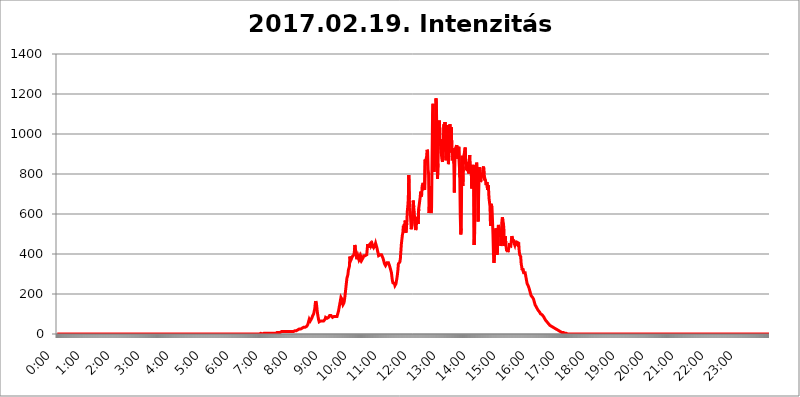
| Category | 2017.02.19. Intenzitás [W/m^2] |
|---|---|
| 0.0 | 0 |
| 0.0006944444444444445 | 0 |
| 0.001388888888888889 | 0 |
| 0.0020833333333333333 | 0 |
| 0.002777777777777778 | 0 |
| 0.003472222222222222 | 0 |
| 0.004166666666666667 | 0 |
| 0.004861111111111111 | 0 |
| 0.005555555555555556 | 0 |
| 0.0062499999999999995 | 0 |
| 0.006944444444444444 | 0 |
| 0.007638888888888889 | 0 |
| 0.008333333333333333 | 0 |
| 0.009027777777777779 | 0 |
| 0.009722222222222222 | 0 |
| 0.010416666666666666 | 0 |
| 0.011111111111111112 | 0 |
| 0.011805555555555555 | 0 |
| 0.012499999999999999 | 0 |
| 0.013194444444444444 | 0 |
| 0.013888888888888888 | 0 |
| 0.014583333333333332 | 0 |
| 0.015277777777777777 | 0 |
| 0.015972222222222224 | 0 |
| 0.016666666666666666 | 0 |
| 0.017361111111111112 | 0 |
| 0.018055555555555557 | 0 |
| 0.01875 | 0 |
| 0.019444444444444445 | 0 |
| 0.02013888888888889 | 0 |
| 0.020833333333333332 | 0 |
| 0.02152777777777778 | 0 |
| 0.022222222222222223 | 0 |
| 0.02291666666666667 | 0 |
| 0.02361111111111111 | 0 |
| 0.024305555555555556 | 0 |
| 0.024999999999999998 | 0 |
| 0.025694444444444447 | 0 |
| 0.02638888888888889 | 0 |
| 0.027083333333333334 | 0 |
| 0.027777777777777776 | 0 |
| 0.02847222222222222 | 0 |
| 0.029166666666666664 | 0 |
| 0.029861111111111113 | 0 |
| 0.030555555555555555 | 0 |
| 0.03125 | 0 |
| 0.03194444444444445 | 0 |
| 0.03263888888888889 | 0 |
| 0.03333333333333333 | 0 |
| 0.034027777777777775 | 0 |
| 0.034722222222222224 | 0 |
| 0.035416666666666666 | 0 |
| 0.036111111111111115 | 0 |
| 0.03680555555555556 | 0 |
| 0.0375 | 0 |
| 0.03819444444444444 | 0 |
| 0.03888888888888889 | 0 |
| 0.03958333333333333 | 0 |
| 0.04027777777777778 | 0 |
| 0.04097222222222222 | 0 |
| 0.041666666666666664 | 0 |
| 0.042361111111111106 | 0 |
| 0.04305555555555556 | 0 |
| 0.043750000000000004 | 0 |
| 0.044444444444444446 | 0 |
| 0.04513888888888889 | 0 |
| 0.04583333333333334 | 0 |
| 0.04652777777777778 | 0 |
| 0.04722222222222222 | 0 |
| 0.04791666666666666 | 0 |
| 0.04861111111111111 | 0 |
| 0.049305555555555554 | 0 |
| 0.049999999999999996 | 0 |
| 0.05069444444444445 | 0 |
| 0.051388888888888894 | 0 |
| 0.052083333333333336 | 0 |
| 0.05277777777777778 | 0 |
| 0.05347222222222222 | 0 |
| 0.05416666666666667 | 0 |
| 0.05486111111111111 | 0 |
| 0.05555555555555555 | 0 |
| 0.05625 | 0 |
| 0.05694444444444444 | 0 |
| 0.057638888888888885 | 0 |
| 0.05833333333333333 | 0 |
| 0.05902777777777778 | 0 |
| 0.059722222222222225 | 0 |
| 0.06041666666666667 | 0 |
| 0.061111111111111116 | 0 |
| 0.06180555555555556 | 0 |
| 0.0625 | 0 |
| 0.06319444444444444 | 0 |
| 0.06388888888888888 | 0 |
| 0.06458333333333334 | 0 |
| 0.06527777777777778 | 0 |
| 0.06597222222222222 | 0 |
| 0.06666666666666667 | 0 |
| 0.06736111111111111 | 0 |
| 0.06805555555555555 | 0 |
| 0.06874999999999999 | 0 |
| 0.06944444444444443 | 0 |
| 0.07013888888888889 | 0 |
| 0.07083333333333333 | 0 |
| 0.07152777777777779 | 0 |
| 0.07222222222222223 | 0 |
| 0.07291666666666667 | 0 |
| 0.07361111111111111 | 0 |
| 0.07430555555555556 | 0 |
| 0.075 | 0 |
| 0.07569444444444444 | 0 |
| 0.0763888888888889 | 0 |
| 0.07708333333333334 | 0 |
| 0.07777777777777778 | 0 |
| 0.07847222222222222 | 0 |
| 0.07916666666666666 | 0 |
| 0.0798611111111111 | 0 |
| 0.08055555555555556 | 0 |
| 0.08125 | 0 |
| 0.08194444444444444 | 0 |
| 0.08263888888888889 | 0 |
| 0.08333333333333333 | 0 |
| 0.08402777777777777 | 0 |
| 0.08472222222222221 | 0 |
| 0.08541666666666665 | 0 |
| 0.08611111111111112 | 0 |
| 0.08680555555555557 | 0 |
| 0.08750000000000001 | 0 |
| 0.08819444444444445 | 0 |
| 0.08888888888888889 | 0 |
| 0.08958333333333333 | 0 |
| 0.09027777777777778 | 0 |
| 0.09097222222222222 | 0 |
| 0.09166666666666667 | 0 |
| 0.09236111111111112 | 0 |
| 0.09305555555555556 | 0 |
| 0.09375 | 0 |
| 0.09444444444444444 | 0 |
| 0.09513888888888888 | 0 |
| 0.09583333333333333 | 0 |
| 0.09652777777777777 | 0 |
| 0.09722222222222222 | 0 |
| 0.09791666666666667 | 0 |
| 0.09861111111111111 | 0 |
| 0.09930555555555555 | 0 |
| 0.09999999999999999 | 0 |
| 0.10069444444444443 | 0 |
| 0.1013888888888889 | 0 |
| 0.10208333333333335 | 0 |
| 0.10277777777777779 | 0 |
| 0.10347222222222223 | 0 |
| 0.10416666666666667 | 0 |
| 0.10486111111111111 | 0 |
| 0.10555555555555556 | 0 |
| 0.10625 | 0 |
| 0.10694444444444444 | 0 |
| 0.1076388888888889 | 0 |
| 0.10833333333333334 | 0 |
| 0.10902777777777778 | 0 |
| 0.10972222222222222 | 0 |
| 0.1111111111111111 | 0 |
| 0.11180555555555556 | 0 |
| 0.11180555555555556 | 0 |
| 0.1125 | 0 |
| 0.11319444444444444 | 0 |
| 0.11388888888888889 | 0 |
| 0.11458333333333333 | 0 |
| 0.11527777777777777 | 0 |
| 0.11597222222222221 | 0 |
| 0.11666666666666665 | 0 |
| 0.1173611111111111 | 0 |
| 0.11805555555555557 | 0 |
| 0.11944444444444445 | 0 |
| 0.12013888888888889 | 0 |
| 0.12083333333333333 | 0 |
| 0.12152777777777778 | 0 |
| 0.12222222222222223 | 0 |
| 0.12291666666666667 | 0 |
| 0.12291666666666667 | 0 |
| 0.12361111111111112 | 0 |
| 0.12430555555555556 | 0 |
| 0.125 | 0 |
| 0.12569444444444444 | 0 |
| 0.12638888888888888 | 0 |
| 0.12708333333333333 | 0 |
| 0.16875 | 0 |
| 0.12847222222222224 | 0 |
| 0.12916666666666668 | 0 |
| 0.12986111111111112 | 0 |
| 0.13055555555555556 | 0 |
| 0.13125 | 0 |
| 0.13194444444444445 | 0 |
| 0.1326388888888889 | 0 |
| 0.13333333333333333 | 0 |
| 0.13402777777777777 | 0 |
| 0.13402777777777777 | 0 |
| 0.13472222222222222 | 0 |
| 0.13541666666666666 | 0 |
| 0.1361111111111111 | 0 |
| 0.13749999999999998 | 0 |
| 0.13819444444444443 | 0 |
| 0.1388888888888889 | 0 |
| 0.13958333333333334 | 0 |
| 0.14027777777777778 | 0 |
| 0.14097222222222222 | 0 |
| 0.14166666666666666 | 0 |
| 0.1423611111111111 | 0 |
| 0.14305555555555557 | 0 |
| 0.14375000000000002 | 0 |
| 0.14444444444444446 | 0 |
| 0.1451388888888889 | 0 |
| 0.1451388888888889 | 0 |
| 0.14652777777777778 | 0 |
| 0.14722222222222223 | 0 |
| 0.14791666666666667 | 0 |
| 0.1486111111111111 | 0 |
| 0.14930555555555555 | 0 |
| 0.15 | 0 |
| 0.15069444444444444 | 0 |
| 0.15138888888888888 | 0 |
| 0.15208333333333332 | 0 |
| 0.15277777777777776 | 0 |
| 0.15347222222222223 | 0 |
| 0.15416666666666667 | 0 |
| 0.15486111111111112 | 0 |
| 0.15555555555555556 | 0 |
| 0.15625 | 0 |
| 0.15694444444444444 | 0 |
| 0.15763888888888888 | 0 |
| 0.15833333333333333 | 0 |
| 0.15902777777777777 | 0 |
| 0.15972222222222224 | 0 |
| 0.16041666666666668 | 0 |
| 0.16111111111111112 | 0 |
| 0.16180555555555556 | 0 |
| 0.1625 | 0 |
| 0.16319444444444445 | 0 |
| 0.1638888888888889 | 0 |
| 0.16458333333333333 | 0 |
| 0.16527777777777777 | 0 |
| 0.16597222222222222 | 0 |
| 0.16666666666666666 | 0 |
| 0.1673611111111111 | 0 |
| 0.16805555555555554 | 0 |
| 0.16874999999999998 | 0 |
| 0.16944444444444443 | 0 |
| 0.17013888888888887 | 0 |
| 0.1708333333333333 | 0 |
| 0.17152777777777775 | 0 |
| 0.17222222222222225 | 0 |
| 0.1729166666666667 | 0 |
| 0.17361111111111113 | 0 |
| 0.17430555555555557 | 0 |
| 0.17500000000000002 | 0 |
| 0.17569444444444446 | 0 |
| 0.1763888888888889 | 0 |
| 0.17708333333333334 | 0 |
| 0.17777777777777778 | 0 |
| 0.17847222222222223 | 0 |
| 0.17916666666666667 | 0 |
| 0.1798611111111111 | 0 |
| 0.18055555555555555 | 0 |
| 0.18125 | 0 |
| 0.18194444444444444 | 0 |
| 0.1826388888888889 | 0 |
| 0.18333333333333335 | 0 |
| 0.1840277777777778 | 0 |
| 0.18472222222222223 | 0 |
| 0.18541666666666667 | 0 |
| 0.18611111111111112 | 0 |
| 0.18680555555555556 | 0 |
| 0.1875 | 0 |
| 0.18819444444444444 | 0 |
| 0.18888888888888888 | 0 |
| 0.18958333333333333 | 0 |
| 0.19027777777777777 | 0 |
| 0.1909722222222222 | 0 |
| 0.19166666666666665 | 0 |
| 0.19236111111111112 | 0 |
| 0.19305555555555554 | 0 |
| 0.19375 | 0 |
| 0.19444444444444445 | 0 |
| 0.1951388888888889 | 0 |
| 0.19583333333333333 | 0 |
| 0.19652777777777777 | 0 |
| 0.19722222222222222 | 0 |
| 0.19791666666666666 | 0 |
| 0.1986111111111111 | 0 |
| 0.19930555555555554 | 0 |
| 0.19999999999999998 | 0 |
| 0.20069444444444443 | 0 |
| 0.20138888888888887 | 0 |
| 0.2020833333333333 | 0 |
| 0.2027777777777778 | 0 |
| 0.2034722222222222 | 0 |
| 0.2041666666666667 | 0 |
| 0.20486111111111113 | 0 |
| 0.20555555555555557 | 0 |
| 0.20625000000000002 | 0 |
| 0.20694444444444446 | 0 |
| 0.2076388888888889 | 0 |
| 0.20833333333333334 | 0 |
| 0.20902777777777778 | 0 |
| 0.20972222222222223 | 0 |
| 0.21041666666666667 | 0 |
| 0.2111111111111111 | 0 |
| 0.21180555555555555 | 0 |
| 0.2125 | 0 |
| 0.21319444444444444 | 0 |
| 0.2138888888888889 | 0 |
| 0.21458333333333335 | 0 |
| 0.2152777777777778 | 0 |
| 0.21597222222222223 | 0 |
| 0.21666666666666667 | 0 |
| 0.21736111111111112 | 0 |
| 0.21805555555555556 | 0 |
| 0.21875 | 0 |
| 0.21944444444444444 | 0 |
| 0.22013888888888888 | 0 |
| 0.22083333333333333 | 0 |
| 0.22152777777777777 | 0 |
| 0.2222222222222222 | 0 |
| 0.22291666666666665 | 0 |
| 0.2236111111111111 | 0 |
| 0.22430555555555556 | 0 |
| 0.225 | 0 |
| 0.22569444444444445 | 0 |
| 0.2263888888888889 | 0 |
| 0.22708333333333333 | 0 |
| 0.22777777777777777 | 0 |
| 0.22847222222222222 | 0 |
| 0.22916666666666666 | 0 |
| 0.2298611111111111 | 0 |
| 0.23055555555555554 | 0 |
| 0.23124999999999998 | 0 |
| 0.23194444444444443 | 0 |
| 0.23263888888888887 | 0 |
| 0.2333333333333333 | 0 |
| 0.2340277777777778 | 0 |
| 0.2347222222222222 | 0 |
| 0.2354166666666667 | 0 |
| 0.23611111111111113 | 0 |
| 0.23680555555555557 | 0 |
| 0.23750000000000002 | 0 |
| 0.23819444444444446 | 0 |
| 0.2388888888888889 | 0 |
| 0.23958333333333334 | 0 |
| 0.24027777777777778 | 0 |
| 0.24097222222222223 | 0 |
| 0.24166666666666667 | 0 |
| 0.2423611111111111 | 0 |
| 0.24305555555555555 | 0 |
| 0.24375 | 0 |
| 0.24444444444444446 | 0 |
| 0.24513888888888888 | 0 |
| 0.24583333333333335 | 0 |
| 0.2465277777777778 | 0 |
| 0.24722222222222223 | 0 |
| 0.24791666666666667 | 0 |
| 0.24861111111111112 | 0 |
| 0.24930555555555556 | 0 |
| 0.25 | 0 |
| 0.25069444444444444 | 0 |
| 0.2513888888888889 | 0 |
| 0.2520833333333333 | 0 |
| 0.25277777777777777 | 0 |
| 0.2534722222222222 | 0 |
| 0.25416666666666665 | 0 |
| 0.2548611111111111 | 0 |
| 0.2555555555555556 | 0 |
| 0.25625000000000003 | 0 |
| 0.2569444444444445 | 0 |
| 0.2576388888888889 | 0 |
| 0.25833333333333336 | 0 |
| 0.2590277777777778 | 0 |
| 0.25972222222222224 | 0 |
| 0.2604166666666667 | 0 |
| 0.2611111111111111 | 0 |
| 0.26180555555555557 | 0 |
| 0.2625 | 0 |
| 0.26319444444444445 | 0 |
| 0.2638888888888889 | 0 |
| 0.26458333333333334 | 0 |
| 0.2652777777777778 | 0 |
| 0.2659722222222222 | 0 |
| 0.26666666666666666 | 0 |
| 0.2673611111111111 | 0 |
| 0.26805555555555555 | 0 |
| 0.26875 | 0 |
| 0.26944444444444443 | 0 |
| 0.2701388888888889 | 0 |
| 0.2708333333333333 | 0 |
| 0.27152777777777776 | 0 |
| 0.2722222222222222 | 0 |
| 0.27291666666666664 | 0 |
| 0.2736111111111111 | 0 |
| 0.2743055555555555 | 0 |
| 0.27499999999999997 | 0 |
| 0.27569444444444446 | 0 |
| 0.27638888888888885 | 0 |
| 0.27708333333333335 | 0 |
| 0.2777777777777778 | 0 |
| 0.27847222222222223 | 0 |
| 0.2791666666666667 | 0 |
| 0.2798611111111111 | 0 |
| 0.28055555555555556 | 0 |
| 0.28125 | 0 |
| 0.28194444444444444 | 0 |
| 0.2826388888888889 | 0 |
| 0.2833333333333333 | 0 |
| 0.28402777777777777 | 0 |
| 0.2847222222222222 | 0 |
| 0.28541666666666665 | 3.525 |
| 0.28611111111111115 | 0 |
| 0.28680555555555554 | 0 |
| 0.28750000000000003 | 0 |
| 0.2881944444444445 | 0 |
| 0.2888888888888889 | 0 |
| 0.28958333333333336 | 3.525 |
| 0.2902777777777778 | 0 |
| 0.29097222222222224 | 3.525 |
| 0.2916666666666667 | 3.525 |
| 0.2923611111111111 | 3.525 |
| 0.29305555555555557 | 3.525 |
| 0.29375 | 3.525 |
| 0.29444444444444445 | 3.525 |
| 0.2951388888888889 | 3.525 |
| 0.29583333333333334 | 3.525 |
| 0.2965277777777778 | 3.525 |
| 0.2972222222222222 | 3.525 |
| 0.29791666666666666 | 3.525 |
| 0.2986111111111111 | 3.525 |
| 0.29930555555555555 | 3.525 |
| 0.3 | 3.525 |
| 0.30069444444444443 | 3.525 |
| 0.3013888888888889 | 3.525 |
| 0.3020833333333333 | 3.525 |
| 0.30277777777777776 | 3.525 |
| 0.3034722222222222 | 3.525 |
| 0.30416666666666664 | 3.525 |
| 0.3048611111111111 | 3.525 |
| 0.3055555555555555 | 3.525 |
| 0.30624999999999997 | 3.525 |
| 0.3069444444444444 | 7.887 |
| 0.3076388888888889 | 7.887 |
| 0.30833333333333335 | 7.887 |
| 0.3090277777777778 | 7.887 |
| 0.30972222222222223 | 7.887 |
| 0.3104166666666667 | 7.887 |
| 0.3111111111111111 | 7.887 |
| 0.31180555555555556 | 7.887 |
| 0.3125 | 7.887 |
| 0.31319444444444444 | 12.257 |
| 0.3138888888888889 | 12.257 |
| 0.3145833333333333 | 12.257 |
| 0.31527777777777777 | 12.257 |
| 0.3159722222222222 | 12.257 |
| 0.31666666666666665 | 12.257 |
| 0.31736111111111115 | 12.257 |
| 0.31805555555555554 | 12.257 |
| 0.31875000000000003 | 12.257 |
| 0.3194444444444445 | 12.257 |
| 0.3201388888888889 | 12.257 |
| 0.32083333333333336 | 12.257 |
| 0.3215277777777778 | 16.636 |
| 0.32222222222222224 | 16.636 |
| 0.3229166666666667 | 12.257 |
| 0.3236111111111111 | 16.636 |
| 0.32430555555555557 | 16.636 |
| 0.325 | 12.257 |
| 0.32569444444444445 | 12.257 |
| 0.3263888888888889 | 12.257 |
| 0.32708333333333334 | 12.257 |
| 0.3277777777777778 | 12.257 |
| 0.3284722222222222 | 12.257 |
| 0.32916666666666666 | 12.257 |
| 0.3298611111111111 | 12.257 |
| 0.33055555555555555 | 12.257 |
| 0.33125 | 12.257 |
| 0.33194444444444443 | 12.257 |
| 0.3326388888888889 | 16.636 |
| 0.3333333333333333 | 16.636 |
| 0.3340277777777778 | 21.024 |
| 0.3347222222222222 | 16.636 |
| 0.3354166666666667 | 16.636 |
| 0.3361111111111111 | 21.024 |
| 0.3368055555555556 | 21.024 |
| 0.33749999999999997 | 21.024 |
| 0.33819444444444446 | 25.419 |
| 0.33888888888888885 | 25.419 |
| 0.33958333333333335 | 25.419 |
| 0.34027777777777773 | 25.419 |
| 0.34097222222222223 | 25.419 |
| 0.3416666666666666 | 25.419 |
| 0.3423611111111111 | 29.823 |
| 0.3430555555555555 | 29.823 |
| 0.34375 | 29.823 |
| 0.3444444444444445 | 29.823 |
| 0.3451388888888889 | 29.823 |
| 0.3458333333333334 | 34.234 |
| 0.34652777777777777 | 34.234 |
| 0.34722222222222227 | 34.234 |
| 0.34791666666666665 | 34.234 |
| 0.34861111111111115 | 34.234 |
| 0.34930555555555554 | 34.234 |
| 0.35000000000000003 | 38.653 |
| 0.3506944444444444 | 38.653 |
| 0.3513888888888889 | 47.511 |
| 0.3520833333333333 | 56.398 |
| 0.3527777777777778 | 65.31 |
| 0.3534722222222222 | 74.246 |
| 0.3541666666666667 | 69.775 |
| 0.3548611111111111 | 65.31 |
| 0.35555555555555557 | 65.31 |
| 0.35625 | 65.31 |
| 0.35694444444444445 | 78.722 |
| 0.3576388888888889 | 83.205 |
| 0.35833333333333334 | 92.184 |
| 0.3590277777777778 | 92.184 |
| 0.3597222222222222 | 101.184 |
| 0.36041666666666666 | 114.716 |
| 0.3611111111111111 | 123.758 |
| 0.36180555555555555 | 150.964 |
| 0.3625 | 164.605 |
| 0.36319444444444443 | 169.156 |
| 0.3638888888888889 | 141.884 |
| 0.3645833333333333 | 114.716 |
| 0.3652777777777778 | 96.682 |
| 0.3659722222222222 | 83.205 |
| 0.3666666666666667 | 69.775 |
| 0.3673611111111111 | 60.85 |
| 0.3680555555555556 | 56.398 |
| 0.36874999999999997 | 60.85 |
| 0.36944444444444446 | 65.31 |
| 0.37013888888888885 | 60.85 |
| 0.37083333333333335 | 60.85 |
| 0.37152777777777773 | 65.31 |
| 0.37222222222222223 | 65.31 |
| 0.3729166666666666 | 65.31 |
| 0.3736111111111111 | 65.31 |
| 0.3743055555555555 | 60.85 |
| 0.375 | 65.31 |
| 0.3756944444444445 | 74.246 |
| 0.3763888888888889 | 83.205 |
| 0.3770833333333334 | 87.692 |
| 0.37777777777777777 | 83.205 |
| 0.37847222222222227 | 78.722 |
| 0.37916666666666665 | 78.722 |
| 0.37986111111111115 | 78.722 |
| 0.38055555555555554 | 83.205 |
| 0.38125000000000003 | 83.205 |
| 0.3819444444444444 | 92.184 |
| 0.3826388888888889 | 92.184 |
| 0.3833333333333333 | 92.184 |
| 0.3840277777777778 | 92.184 |
| 0.3847222222222222 | 96.682 |
| 0.3854166666666667 | 92.184 |
| 0.3861111111111111 | 83.205 |
| 0.38680555555555557 | 83.205 |
| 0.3875 | 83.205 |
| 0.38819444444444445 | 87.692 |
| 0.3888888888888889 | 92.184 |
| 0.38958333333333334 | 92.184 |
| 0.3902777777777778 | 87.692 |
| 0.3909722222222222 | 83.205 |
| 0.39166666666666666 | 83.205 |
| 0.3923611111111111 | 87.692 |
| 0.39305555555555555 | 92.184 |
| 0.39375 | 105.69 |
| 0.39444444444444443 | 114.716 |
| 0.3951388888888889 | 128.284 |
| 0.3958333333333333 | 141.884 |
| 0.3965277777777778 | 155.509 |
| 0.3972222222222222 | 169.156 |
| 0.3979166666666667 | 182.82 |
| 0.3986111111111111 | 182.82 |
| 0.3993055555555556 | 173.709 |
| 0.39999999999999997 | 155.509 |
| 0.40069444444444446 | 146.423 |
| 0.40138888888888885 | 146.423 |
| 0.40208333333333335 | 155.509 |
| 0.40277777777777773 | 169.156 |
| 0.40347222222222223 | 187.378 |
| 0.4041666666666666 | 210.182 |
| 0.4048611111111111 | 233 |
| 0.4055555555555555 | 255.813 |
| 0.40625 | 278.603 |
| 0.4069444444444445 | 287.709 |
| 0.4076388888888889 | 296.808 |
| 0.4083333333333334 | 319.517 |
| 0.40902777777777777 | 328.584 |
| 0.40972222222222227 | 337.639 |
| 0.41041666666666665 | 387.202 |
| 0.41111111111111115 | 391.685 |
| 0.41180555555555554 | 369.23 |
| 0.41250000000000003 | 373.729 |
| 0.4131944444444444 | 373.729 |
| 0.4138888888888889 | 387.202 |
| 0.4145833333333333 | 387.202 |
| 0.4152777777777778 | 391.685 |
| 0.4159722222222222 | 396.164 |
| 0.4166666666666667 | 409.574 |
| 0.4173611111111111 | 445.129 |
| 0.41805555555555557 | 431.833 |
| 0.41875 | 400.638 |
| 0.41944444444444445 | 391.685 |
| 0.4201388888888889 | 373.729 |
| 0.42083333333333334 | 373.729 |
| 0.4215277777777778 | 391.685 |
| 0.4222222222222222 | 396.164 |
| 0.42291666666666666 | 373.729 |
| 0.4236111111111111 | 369.23 |
| 0.42430555555555555 | 387.202 |
| 0.425 | 378.224 |
| 0.42569444444444443 | 387.202 |
| 0.4263888888888889 | 387.202 |
| 0.4270833333333333 | 369.23 |
| 0.4277777777777778 | 364.728 |
| 0.4284722222222222 | 373.729 |
| 0.4291666666666667 | 382.715 |
| 0.4298611111111111 | 391.685 |
| 0.4305555555555556 | 391.685 |
| 0.43124999999999997 | 391.685 |
| 0.43194444444444446 | 391.685 |
| 0.43263888888888885 | 391.685 |
| 0.43333333333333335 | 391.685 |
| 0.43402777777777773 | 396.164 |
| 0.43472222222222223 | 422.943 |
| 0.4354166666666666 | 449.551 |
| 0.4361111111111111 | 431.833 |
| 0.4368055555555555 | 431.833 |
| 0.4375 | 445.129 |
| 0.4381944444444445 | 440.702 |
| 0.4388888888888889 | 449.551 |
| 0.4395833333333334 | 453.968 |
| 0.44027777777777777 | 440.702 |
| 0.44097222222222227 | 445.129 |
| 0.44166666666666665 | 449.551 |
| 0.44236111111111115 | 440.702 |
| 0.44305555555555554 | 440.702 |
| 0.44375000000000003 | 431.833 |
| 0.4444444444444444 | 427.39 |
| 0.4451388888888889 | 431.833 |
| 0.4458333333333333 | 445.129 |
| 0.4465277777777778 | 453.968 |
| 0.4472222222222222 | 458.38 |
| 0.4479166666666667 | 449.551 |
| 0.4486111111111111 | 427.39 |
| 0.44930555555555557 | 414.035 |
| 0.45 | 405.108 |
| 0.45069444444444445 | 391.685 |
| 0.4513888888888889 | 387.202 |
| 0.45208333333333334 | 396.164 |
| 0.4527777777777778 | 396.164 |
| 0.4534722222222222 | 391.685 |
| 0.45416666666666666 | 391.685 |
| 0.4548611111111111 | 396.164 |
| 0.45555555555555555 | 396.164 |
| 0.45625 | 391.685 |
| 0.45694444444444443 | 378.224 |
| 0.4576388888888889 | 369.23 |
| 0.4583333333333333 | 360.221 |
| 0.4590277777777778 | 351.198 |
| 0.4597222222222222 | 346.682 |
| 0.4604166666666667 | 342.162 |
| 0.4611111111111111 | 346.682 |
| 0.4618055555555556 | 346.682 |
| 0.46249999999999997 | 355.712 |
| 0.46319444444444446 | 355.712 |
| 0.46388888888888885 | 355.712 |
| 0.46458333333333335 | 355.712 |
| 0.46527777777777773 | 351.198 |
| 0.46597222222222223 | 342.162 |
| 0.4666666666666666 | 337.639 |
| 0.4673611111111111 | 324.052 |
| 0.4680555555555555 | 314.98 |
| 0.46875 | 305.898 |
| 0.4694444444444445 | 283.156 |
| 0.4701388888888889 | 264.932 |
| 0.4708333333333334 | 255.813 |
| 0.47152777777777777 | 255.813 |
| 0.47222222222222227 | 255.813 |
| 0.47291666666666665 | 251.251 |
| 0.47361111111111115 | 242.127 |
| 0.47430555555555554 | 246.689 |
| 0.47500000000000003 | 251.251 |
| 0.4756944444444444 | 264.932 |
| 0.4763888888888889 | 278.603 |
| 0.4770833333333333 | 296.808 |
| 0.4777777777777778 | 319.517 |
| 0.4784722222222222 | 351.198 |
| 0.4791666666666667 | 346.682 |
| 0.4798611111111111 | 351.198 |
| 0.48055555555555557 | 360.221 |
| 0.48125 | 378.224 |
| 0.48194444444444445 | 414.035 |
| 0.4826388888888889 | 449.551 |
| 0.48333333333333334 | 471.582 |
| 0.4840277777777778 | 493.475 |
| 0.4847222222222222 | 506.542 |
| 0.48541666666666666 | 541.121 |
| 0.4861111111111111 | 515.223 |
| 0.48680555555555555 | 549.704 |
| 0.4875 | 541.121 |
| 0.48819444444444443 | 566.793 |
| 0.4888888888888889 | 506.542 |
| 0.4895833333333333 | 510.885 |
| 0.4902777777777778 | 553.986 |
| 0.4909722222222222 | 613.252 |
| 0.4916666666666667 | 638.256 |
| 0.4923611111111111 | 675.311 |
| 0.4930555555555556 | 795.074 |
| 0.49374999999999997 | 675.311 |
| 0.49444444444444446 | 634.105 |
| 0.49513888888888885 | 604.864 |
| 0.49583333333333335 | 566.793 |
| 0.49652777777777773 | 523.88 |
| 0.49722222222222223 | 523.88 |
| 0.4979166666666666 | 523.88 |
| 0.4986111111111111 | 596.45 |
| 0.4993055555555555 | 667.123 |
| 0.5 | 634.105 |
| 0.5006944444444444 | 609.062 |
| 0.5013888888888889 | 553.986 |
| 0.5020833333333333 | 532.513 |
| 0.5027777777777778 | 519.555 |
| 0.5034722222222222 | 532.513 |
| 0.5041666666666667 | 571.049 |
| 0.5048611111111111 | 571.049 |
| 0.5055555555555555 | 562.53 |
| 0.50625 | 549.704 |
| 0.5069444444444444 | 625.784 |
| 0.5076388888888889 | 625.784 |
| 0.5083333333333333 | 621.613 |
| 0.5090277777777777 | 683.473 |
| 0.5097222222222222 | 711.832 |
| 0.5104166666666666 | 687.544 |
| 0.5111111111111112 | 695.666 |
| 0.5118055555555555 | 739.877 |
| 0.5125000000000001 | 743.859 |
| 0.5131944444444444 | 755.766 |
| 0.513888888888889 | 759.723 |
| 0.5145833333333333 | 751.803 |
| 0.5152777777777778 | 719.877 |
| 0.5159722222222222 | 872.114 |
| 0.5166666666666667 | 864.493 |
| 0.517361111111111 | 864.493 |
| 0.5180555555555556 | 887.309 |
| 0.5187499999999999 | 921.298 |
| 0.5194444444444445 | 913.766 |
| 0.5201388888888888 | 822.26 |
| 0.5208333333333334 | 798.974 |
| 0.5215277777777778 | 604.864 |
| 0.5222222222222223 | 658.909 |
| 0.5229166666666667 | 739.877 |
| 0.5236111111111111 | 617.436 |
| 0.5243055555555556 | 604.864 |
| 0.525 | 629.948 |
| 0.5256944444444445 | 872.114 |
| 0.5263888888888889 | 1097.437 |
| 0.5270833333333333 | 1150.946 |
| 0.5277777777777778 | 894.885 |
| 0.5284722222222222 | 810.641 |
| 0.5291666666666667 | 849.199 |
| 0.5298611111111111 | 894.885 |
| 0.5305555555555556 | 1037.277 |
| 0.53125 | 1178.177 |
| 0.5319444444444444 | 1101.226 |
| 0.5326388888888889 | 947.58 |
| 0.5333333333333333 | 775.492 |
| 0.5340277777777778 | 853.029 |
| 0.5347222222222222 | 981.244 |
| 0.5354166666666667 | 977.508 |
| 0.5361111111111111 | 1067.267 |
| 0.5368055555555555 | 940.082 |
| 0.5375 | 973.772 |
| 0.5381944444444444 | 973.772 |
| 0.5388888888888889 | 894.885 |
| 0.5395833333333333 | 872.114 |
| 0.5402777777777777 | 860.676 |
| 0.5409722222222222 | 921.298 |
| 0.5416666666666666 | 977.508 |
| 0.5423611111111112 | 1048.508 |
| 0.5430555555555555 | 913.766 |
| 0.5437500000000001 | 1059.756 |
| 0.5444444444444444 | 966.295 |
| 0.545138888888889 | 868.305 |
| 0.5458333333333333 | 921.298 |
| 0.5465277777777778 | 872.114 |
| 0.5472222222222222 | 1044.762 |
| 0.5479166666666667 | 943.832 |
| 0.548611111111111 | 849.199 |
| 0.5493055555555556 | 887.309 |
| 0.5499999999999999 | 984.98 |
| 0.5506944444444445 | 1048.508 |
| 0.5513888888888888 | 951.327 |
| 0.5520833333333334 | 1011.118 |
| 0.5527777777777778 | 1033.537 |
| 0.5534722222222223 | 906.223 |
| 0.5541666666666667 | 928.819 |
| 0.5548611111111111 | 868.305 |
| 0.5555555555555556 | 909.996 |
| 0.55625 | 853.029 |
| 0.5569444444444445 | 707.8 |
| 0.5576388888888889 | 917.534 |
| 0.5583333333333333 | 925.06 |
| 0.5590277777777778 | 917.534 |
| 0.5597222222222222 | 913.766 |
| 0.5604166666666667 | 943.832 |
| 0.5611111111111111 | 894.885 |
| 0.5618055555555556 | 875.918 |
| 0.5625 | 898.668 |
| 0.5631944444444444 | 936.33 |
| 0.5638888888888889 | 932.576 |
| 0.5645833333333333 | 783.342 |
| 0.5652777777777778 | 588.009 |
| 0.5659722222222222 | 497.836 |
| 0.5666666666666667 | 528.2 |
| 0.5673611111111111 | 853.029 |
| 0.5680555555555555 | 891.099 |
| 0.56875 | 739.877 |
| 0.5694444444444444 | 837.682 |
| 0.5701388888888889 | 887.309 |
| 0.5708333333333333 | 891.099 |
| 0.5715277777777777 | 883.516 |
| 0.5722222222222222 | 932.576 |
| 0.5729166666666666 | 860.676 |
| 0.5736111111111112 | 818.392 |
| 0.5743055555555555 | 826.123 |
| 0.5750000000000001 | 853.029 |
| 0.5756944444444444 | 814.519 |
| 0.576388888888889 | 860.676 |
| 0.5770833333333333 | 802.868 |
| 0.5777777777777778 | 853.029 |
| 0.5784722222222222 | 894.885 |
| 0.5791666666666667 | 806.757 |
| 0.579861111111111 | 845.365 |
| 0.5805555555555556 | 829.981 |
| 0.5812499999999999 | 727.896 |
| 0.5819444444444445 | 822.26 |
| 0.5826388888888888 | 845.365 |
| 0.5833333333333334 | 829.981 |
| 0.5840277777777778 | 845.365 |
| 0.5847222222222223 | 445.129 |
| 0.5854166666666667 | 506.542 |
| 0.5861111111111111 | 654.791 |
| 0.5868055555555556 | 767.62 |
| 0.5875 | 841.526 |
| 0.5881944444444445 | 856.855 |
| 0.5888888888888889 | 810.641 |
| 0.5895833333333333 | 735.89 |
| 0.5902777777777778 | 562.53 |
| 0.5909722222222222 | 687.544 |
| 0.5916666666666667 | 795.074 |
| 0.5923611111111111 | 833.834 |
| 0.5930555555555556 | 787.258 |
| 0.59375 | 759.723 |
| 0.5944444444444444 | 771.559 |
| 0.5951388888888889 | 795.074 |
| 0.5958333333333333 | 783.342 |
| 0.5965277777777778 | 802.868 |
| 0.5972222222222222 | 829.981 |
| 0.5979166666666667 | 837.682 |
| 0.5986111111111111 | 798.974 |
| 0.5993055555555555 | 767.62 |
| 0.6 | 775.492 |
| 0.6006944444444444 | 767.62 |
| 0.6013888888888889 | 743.859 |
| 0.6020833333333333 | 743.859 |
| 0.6027777777777777 | 759.723 |
| 0.6034722222222222 | 719.877 |
| 0.6041666666666666 | 743.859 |
| 0.6048611111111112 | 727.896 |
| 0.6055555555555555 | 679.395 |
| 0.6062500000000001 | 675.311 |
| 0.6069444444444444 | 638.256 |
| 0.607638888888889 | 541.121 |
| 0.6083333333333333 | 650.667 |
| 0.6090277777777778 | 646.537 |
| 0.6097222222222222 | 634.105 |
| 0.6104166666666667 | 571.049 |
| 0.611111111111111 | 497.836 |
| 0.6118055555555556 | 400.638 |
| 0.6124999999999999 | 355.712 |
| 0.6131944444444445 | 391.685 |
| 0.6138888888888888 | 462.786 |
| 0.6145833333333334 | 515.223 |
| 0.6152777777777778 | 528.2 |
| 0.6159722222222223 | 502.192 |
| 0.6166666666666667 | 396.164 |
| 0.6173611111111111 | 409.574 |
| 0.6180555555555556 | 519.555 |
| 0.61875 | 545.416 |
| 0.6194444444444445 | 549.704 |
| 0.6201388888888889 | 519.555 |
| 0.6208333333333333 | 510.885 |
| 0.6215277777777778 | 523.88 |
| 0.6222222222222222 | 440.702 |
| 0.6229166666666667 | 449.551 |
| 0.6236111111111111 | 562.53 |
| 0.6243055555555556 | 583.779 |
| 0.625 | 566.793 |
| 0.6256944444444444 | 553.986 |
| 0.6263888888888889 | 528.2 |
| 0.6270833333333333 | 440.702 |
| 0.6277777777777778 | 475.972 |
| 0.6284722222222222 | 489.108 |
| 0.6291666666666667 | 445.129 |
| 0.6298611111111111 | 427.39 |
| 0.6305555555555555 | 414.035 |
| 0.63125 | 427.39 |
| 0.6319444444444444 | 409.574 |
| 0.6326388888888889 | 418.492 |
| 0.6333333333333333 | 431.833 |
| 0.6340277777777777 | 445.129 |
| 0.6347222222222222 | 449.551 |
| 0.6354166666666666 | 449.551 |
| 0.6361111111111112 | 440.702 |
| 0.6368055555555555 | 462.786 |
| 0.6375000000000001 | 489.108 |
| 0.6381944444444444 | 484.735 |
| 0.638888888888889 | 471.582 |
| 0.6395833333333333 | 467.187 |
| 0.6402777777777778 | 458.38 |
| 0.6409722222222222 | 453.968 |
| 0.6416666666666667 | 445.129 |
| 0.642361111111111 | 458.38 |
| 0.6430555555555556 | 458.38 |
| 0.6437499999999999 | 458.38 |
| 0.6444444444444445 | 449.551 |
| 0.6451388888888888 | 458.38 |
| 0.6458333333333334 | 462.786 |
| 0.6465277777777778 | 462.786 |
| 0.6472222222222223 | 453.968 |
| 0.6479166666666667 | 414.035 |
| 0.6486111111111111 | 396.164 |
| 0.6493055555555556 | 396.164 |
| 0.65 | 387.202 |
| 0.6506944444444445 | 351.198 |
| 0.6513888888888889 | 337.639 |
| 0.6520833333333333 | 319.517 |
| 0.6527777777777778 | 328.584 |
| 0.6534722222222222 | 324.052 |
| 0.6541666666666667 | 305.898 |
| 0.6548611111111111 | 305.898 |
| 0.6555555555555556 | 305.898 |
| 0.65625 | 305.898 |
| 0.6569444444444444 | 301.354 |
| 0.6576388888888889 | 278.603 |
| 0.6583333333333333 | 264.932 |
| 0.6590277777777778 | 251.251 |
| 0.6597222222222222 | 246.689 |
| 0.6604166666666667 | 242.127 |
| 0.6611111111111111 | 237.564 |
| 0.6618055555555555 | 228.436 |
| 0.6625 | 219.309 |
| 0.6631944444444444 | 210.182 |
| 0.6638888888888889 | 201.058 |
| 0.6645833333333333 | 191.937 |
| 0.6652777777777777 | 187.378 |
| 0.6659722222222222 | 191.937 |
| 0.6666666666666666 | 182.82 |
| 0.6673611111111111 | 178.264 |
| 0.6680555555555556 | 173.709 |
| 0.6687500000000001 | 164.605 |
| 0.6694444444444444 | 155.509 |
| 0.6701388888888888 | 146.423 |
| 0.6708333333333334 | 141.884 |
| 0.6715277777777778 | 137.347 |
| 0.6722222222222222 | 132.814 |
| 0.6729166666666666 | 128.284 |
| 0.6736111111111112 | 123.758 |
| 0.6743055555555556 | 119.235 |
| 0.6749999999999999 | 119.235 |
| 0.6756944444444444 | 114.716 |
| 0.6763888888888889 | 110.201 |
| 0.6770833333333334 | 105.69 |
| 0.6777777777777777 | 101.184 |
| 0.6784722222222223 | 101.184 |
| 0.6791666666666667 | 96.682 |
| 0.6798611111111111 | 96.682 |
| 0.6805555555555555 | 92.184 |
| 0.68125 | 92.184 |
| 0.6819444444444445 | 87.692 |
| 0.6826388888888889 | 83.205 |
| 0.6833333333333332 | 78.722 |
| 0.6840277777777778 | 74.246 |
| 0.6847222222222222 | 69.775 |
| 0.6854166666666667 | 65.31 |
| 0.686111111111111 | 65.31 |
| 0.6868055555555556 | 60.85 |
| 0.6875 | 56.398 |
| 0.6881944444444444 | 56.398 |
| 0.688888888888889 | 51.951 |
| 0.6895833333333333 | 47.511 |
| 0.6902777777777778 | 47.511 |
| 0.6909722222222222 | 43.079 |
| 0.6916666666666668 | 43.079 |
| 0.6923611111111111 | 43.079 |
| 0.6930555555555555 | 38.653 |
| 0.69375 | 38.653 |
| 0.6944444444444445 | 38.653 |
| 0.6951388888888889 | 34.234 |
| 0.6958333333333333 | 29.823 |
| 0.6965277777777777 | 29.823 |
| 0.6972222222222223 | 29.823 |
| 0.6979166666666666 | 25.419 |
| 0.6986111111111111 | 25.419 |
| 0.6993055555555556 | 25.419 |
| 0.7000000000000001 | 21.024 |
| 0.7006944444444444 | 21.024 |
| 0.7013888888888888 | 21.024 |
| 0.7020833333333334 | 16.636 |
| 0.7027777777777778 | 16.636 |
| 0.7034722222222222 | 16.636 |
| 0.7041666666666666 | 12.257 |
| 0.7048611111111112 | 12.257 |
| 0.7055555555555556 | 12.257 |
| 0.7062499999999999 | 12.257 |
| 0.7069444444444444 | 12.257 |
| 0.7076388888888889 | 7.887 |
| 0.7083333333333334 | 7.887 |
| 0.7090277777777777 | 7.887 |
| 0.7097222222222223 | 7.887 |
| 0.7104166666666667 | 3.525 |
| 0.7111111111111111 | 3.525 |
| 0.7118055555555555 | 3.525 |
| 0.7125 | 3.525 |
| 0.7131944444444445 | 3.525 |
| 0.7138888888888889 | 3.525 |
| 0.7145833333333332 | 3.525 |
| 0.7152777777777778 | 3.525 |
| 0.7159722222222222 | 0 |
| 0.7166666666666667 | 0 |
| 0.717361111111111 | 0 |
| 0.7180555555555556 | 0 |
| 0.71875 | 0 |
| 0.7194444444444444 | 0 |
| 0.720138888888889 | 0 |
| 0.7208333333333333 | 0 |
| 0.7215277777777778 | 0 |
| 0.7222222222222222 | 0 |
| 0.7229166666666668 | 0 |
| 0.7236111111111111 | 0 |
| 0.7243055555555555 | 0 |
| 0.725 | 0 |
| 0.7256944444444445 | 0 |
| 0.7263888888888889 | 0 |
| 0.7270833333333333 | 0 |
| 0.7277777777777777 | 0 |
| 0.7284722222222223 | 0 |
| 0.7291666666666666 | 0 |
| 0.7298611111111111 | 0 |
| 0.7305555555555556 | 0 |
| 0.7312500000000001 | 0 |
| 0.7319444444444444 | 0 |
| 0.7326388888888888 | 0 |
| 0.7333333333333334 | 0 |
| 0.7340277777777778 | 0 |
| 0.7347222222222222 | 0 |
| 0.7354166666666666 | 0 |
| 0.7361111111111112 | 0 |
| 0.7368055555555556 | 0 |
| 0.7374999999999999 | 0 |
| 0.7381944444444444 | 0 |
| 0.7388888888888889 | 0 |
| 0.7395833333333334 | 0 |
| 0.7402777777777777 | 0 |
| 0.7409722222222223 | 0 |
| 0.7416666666666667 | 0 |
| 0.7423611111111111 | 0 |
| 0.7430555555555555 | 0 |
| 0.74375 | 0 |
| 0.7444444444444445 | 0 |
| 0.7451388888888889 | 0 |
| 0.7458333333333332 | 0 |
| 0.7465277777777778 | 0 |
| 0.7472222222222222 | 0 |
| 0.7479166666666667 | 0 |
| 0.748611111111111 | 0 |
| 0.7493055555555556 | 0 |
| 0.75 | 0 |
| 0.7506944444444444 | 0 |
| 0.751388888888889 | 0 |
| 0.7520833333333333 | 0 |
| 0.7527777777777778 | 0 |
| 0.7534722222222222 | 0 |
| 0.7541666666666668 | 0 |
| 0.7548611111111111 | 0 |
| 0.7555555555555555 | 0 |
| 0.75625 | 0 |
| 0.7569444444444445 | 0 |
| 0.7576388888888889 | 0 |
| 0.7583333333333333 | 0 |
| 0.7590277777777777 | 0 |
| 0.7597222222222223 | 0 |
| 0.7604166666666666 | 0 |
| 0.7611111111111111 | 0 |
| 0.7618055555555556 | 0 |
| 0.7625000000000001 | 0 |
| 0.7631944444444444 | 0 |
| 0.7638888888888888 | 0 |
| 0.7645833333333334 | 0 |
| 0.7652777777777778 | 0 |
| 0.7659722222222222 | 0 |
| 0.7666666666666666 | 0 |
| 0.7673611111111112 | 0 |
| 0.7680555555555556 | 0 |
| 0.7687499999999999 | 0 |
| 0.7694444444444444 | 0 |
| 0.7701388888888889 | 0 |
| 0.7708333333333334 | 0 |
| 0.7715277777777777 | 0 |
| 0.7722222222222223 | 0 |
| 0.7729166666666667 | 0 |
| 0.7736111111111111 | 0 |
| 0.7743055555555555 | 0 |
| 0.775 | 0 |
| 0.7756944444444445 | 0 |
| 0.7763888888888889 | 0 |
| 0.7770833333333332 | 0 |
| 0.7777777777777778 | 0 |
| 0.7784722222222222 | 0 |
| 0.7791666666666667 | 0 |
| 0.779861111111111 | 0 |
| 0.7805555555555556 | 0 |
| 0.78125 | 0 |
| 0.7819444444444444 | 0 |
| 0.782638888888889 | 0 |
| 0.7833333333333333 | 0 |
| 0.7840277777777778 | 0 |
| 0.7847222222222222 | 0 |
| 0.7854166666666668 | 0 |
| 0.7861111111111111 | 0 |
| 0.7868055555555555 | 0 |
| 0.7875 | 0 |
| 0.7881944444444445 | 0 |
| 0.7888888888888889 | 0 |
| 0.7895833333333333 | 0 |
| 0.7902777777777777 | 0 |
| 0.7909722222222223 | 0 |
| 0.7916666666666666 | 0 |
| 0.7923611111111111 | 0 |
| 0.7930555555555556 | 0 |
| 0.7937500000000001 | 0 |
| 0.7944444444444444 | 0 |
| 0.7951388888888888 | 0 |
| 0.7958333333333334 | 0 |
| 0.7965277777777778 | 0 |
| 0.7972222222222222 | 0 |
| 0.7979166666666666 | 0 |
| 0.7986111111111112 | 0 |
| 0.7993055555555556 | 0 |
| 0.7999999999999999 | 0 |
| 0.8006944444444444 | 0 |
| 0.8013888888888889 | 0 |
| 0.8020833333333334 | 0 |
| 0.8027777777777777 | 0 |
| 0.8034722222222223 | 0 |
| 0.8041666666666667 | 0 |
| 0.8048611111111111 | 0 |
| 0.8055555555555555 | 0 |
| 0.80625 | 0 |
| 0.8069444444444445 | 0 |
| 0.8076388888888889 | 0 |
| 0.8083333333333332 | 0 |
| 0.8090277777777778 | 0 |
| 0.8097222222222222 | 0 |
| 0.8104166666666667 | 0 |
| 0.811111111111111 | 0 |
| 0.8118055555555556 | 0 |
| 0.8125 | 0 |
| 0.8131944444444444 | 0 |
| 0.813888888888889 | 0 |
| 0.8145833333333333 | 0 |
| 0.8152777777777778 | 0 |
| 0.8159722222222222 | 0 |
| 0.8166666666666668 | 0 |
| 0.8173611111111111 | 0 |
| 0.8180555555555555 | 0 |
| 0.81875 | 0 |
| 0.8194444444444445 | 0 |
| 0.8201388888888889 | 0 |
| 0.8208333333333333 | 0 |
| 0.8215277777777777 | 0 |
| 0.8222222222222223 | 0 |
| 0.8229166666666666 | 0 |
| 0.8236111111111111 | 0 |
| 0.8243055555555556 | 0 |
| 0.8250000000000001 | 0 |
| 0.8256944444444444 | 0 |
| 0.8263888888888888 | 0 |
| 0.8270833333333334 | 0 |
| 0.8277777777777778 | 0 |
| 0.8284722222222222 | 0 |
| 0.8291666666666666 | 0 |
| 0.8298611111111112 | 0 |
| 0.8305555555555556 | 0 |
| 0.8312499999999999 | 0 |
| 0.8319444444444444 | 0 |
| 0.8326388888888889 | 0 |
| 0.8333333333333334 | 0 |
| 0.8340277777777777 | 0 |
| 0.8347222222222223 | 0 |
| 0.8354166666666667 | 0 |
| 0.8361111111111111 | 0 |
| 0.8368055555555555 | 0 |
| 0.8375 | 0 |
| 0.8381944444444445 | 0 |
| 0.8388888888888889 | 0 |
| 0.8395833333333332 | 0 |
| 0.8402777777777778 | 0 |
| 0.8409722222222222 | 0 |
| 0.8416666666666667 | 0 |
| 0.842361111111111 | 0 |
| 0.8430555555555556 | 0 |
| 0.84375 | 0 |
| 0.8444444444444444 | 0 |
| 0.845138888888889 | 0 |
| 0.8458333333333333 | 0 |
| 0.8465277777777778 | 0 |
| 0.8472222222222222 | 0 |
| 0.8479166666666668 | 0 |
| 0.8486111111111111 | 0 |
| 0.8493055555555555 | 0 |
| 0.85 | 0 |
| 0.8506944444444445 | 0 |
| 0.8513888888888889 | 0 |
| 0.8520833333333333 | 0 |
| 0.8527777777777777 | 0 |
| 0.8534722222222223 | 0 |
| 0.8541666666666666 | 0 |
| 0.8548611111111111 | 0 |
| 0.8555555555555556 | 0 |
| 0.8562500000000001 | 0 |
| 0.8569444444444444 | 0 |
| 0.8576388888888888 | 0 |
| 0.8583333333333334 | 0 |
| 0.8590277777777778 | 0 |
| 0.8597222222222222 | 0 |
| 0.8604166666666666 | 0 |
| 0.8611111111111112 | 0 |
| 0.8618055555555556 | 0 |
| 0.8624999999999999 | 0 |
| 0.8631944444444444 | 0 |
| 0.8638888888888889 | 0 |
| 0.8645833333333334 | 0 |
| 0.8652777777777777 | 0 |
| 0.8659722222222223 | 0 |
| 0.8666666666666667 | 0 |
| 0.8673611111111111 | 0 |
| 0.8680555555555555 | 0 |
| 0.86875 | 0 |
| 0.8694444444444445 | 0 |
| 0.8701388888888889 | 0 |
| 0.8708333333333332 | 0 |
| 0.8715277777777778 | 0 |
| 0.8722222222222222 | 0 |
| 0.8729166666666667 | 0 |
| 0.873611111111111 | 0 |
| 0.8743055555555556 | 0 |
| 0.875 | 0 |
| 0.8756944444444444 | 0 |
| 0.876388888888889 | 0 |
| 0.8770833333333333 | 0 |
| 0.8777777777777778 | 0 |
| 0.8784722222222222 | 0 |
| 0.8791666666666668 | 0 |
| 0.8798611111111111 | 0 |
| 0.8805555555555555 | 0 |
| 0.88125 | 0 |
| 0.8819444444444445 | 0 |
| 0.8826388888888889 | 0 |
| 0.8833333333333333 | 0 |
| 0.8840277777777777 | 0 |
| 0.8847222222222223 | 0 |
| 0.8854166666666666 | 0 |
| 0.8861111111111111 | 0 |
| 0.8868055555555556 | 0 |
| 0.8875000000000001 | 0 |
| 0.8881944444444444 | 0 |
| 0.8888888888888888 | 0 |
| 0.8895833333333334 | 0 |
| 0.8902777777777778 | 0 |
| 0.8909722222222222 | 0 |
| 0.8916666666666666 | 0 |
| 0.8923611111111112 | 0 |
| 0.8930555555555556 | 0 |
| 0.8937499999999999 | 0 |
| 0.8944444444444444 | 0 |
| 0.8951388888888889 | 0 |
| 0.8958333333333334 | 0 |
| 0.8965277777777777 | 0 |
| 0.8972222222222223 | 0 |
| 0.8979166666666667 | 0 |
| 0.8986111111111111 | 0 |
| 0.8993055555555555 | 0 |
| 0.9 | 0 |
| 0.9006944444444445 | 0 |
| 0.9013888888888889 | 0 |
| 0.9020833333333332 | 0 |
| 0.9027777777777778 | 0 |
| 0.9034722222222222 | 0 |
| 0.9041666666666667 | 0 |
| 0.904861111111111 | 0 |
| 0.9055555555555556 | 0 |
| 0.90625 | 0 |
| 0.9069444444444444 | 0 |
| 0.907638888888889 | 0 |
| 0.9083333333333333 | 0 |
| 0.9090277777777778 | 0 |
| 0.9097222222222222 | 0 |
| 0.9104166666666668 | 0 |
| 0.9111111111111111 | 0 |
| 0.9118055555555555 | 0 |
| 0.9125 | 0 |
| 0.9131944444444445 | 0 |
| 0.9138888888888889 | 0 |
| 0.9145833333333333 | 0 |
| 0.9152777777777777 | 0 |
| 0.9159722222222223 | 0 |
| 0.9166666666666666 | 0 |
| 0.9173611111111111 | 0 |
| 0.9180555555555556 | 0 |
| 0.9187500000000001 | 0 |
| 0.9194444444444444 | 0 |
| 0.9201388888888888 | 0 |
| 0.9208333333333334 | 0 |
| 0.9215277777777778 | 0 |
| 0.9222222222222222 | 0 |
| 0.9229166666666666 | 0 |
| 0.9236111111111112 | 0 |
| 0.9243055555555556 | 0 |
| 0.9249999999999999 | 0 |
| 0.9256944444444444 | 0 |
| 0.9263888888888889 | 0 |
| 0.9270833333333334 | 0 |
| 0.9277777777777777 | 0 |
| 0.9284722222222223 | 0 |
| 0.9291666666666667 | 0 |
| 0.9298611111111111 | 0 |
| 0.9305555555555555 | 0 |
| 0.93125 | 0 |
| 0.9319444444444445 | 0 |
| 0.9326388888888889 | 0 |
| 0.9333333333333332 | 0 |
| 0.9340277777777778 | 0 |
| 0.9347222222222222 | 0 |
| 0.9354166666666667 | 0 |
| 0.936111111111111 | 0 |
| 0.9368055555555556 | 0 |
| 0.9375 | 0 |
| 0.9381944444444444 | 0 |
| 0.938888888888889 | 0 |
| 0.9395833333333333 | 0 |
| 0.9402777777777778 | 0 |
| 0.9409722222222222 | 0 |
| 0.9416666666666668 | 0 |
| 0.9423611111111111 | 0 |
| 0.9430555555555555 | 0 |
| 0.94375 | 0 |
| 0.9444444444444445 | 0 |
| 0.9451388888888889 | 0 |
| 0.9458333333333333 | 0 |
| 0.9465277777777777 | 0 |
| 0.9472222222222223 | 0 |
| 0.9479166666666666 | 0 |
| 0.9486111111111111 | 0 |
| 0.9493055555555556 | 0 |
| 0.9500000000000001 | 0 |
| 0.9506944444444444 | 0 |
| 0.9513888888888888 | 0 |
| 0.9520833333333334 | 0 |
| 0.9527777777777778 | 0 |
| 0.9534722222222222 | 0 |
| 0.9541666666666666 | 0 |
| 0.9548611111111112 | 0 |
| 0.9555555555555556 | 0 |
| 0.9562499999999999 | 0 |
| 0.9569444444444444 | 0 |
| 0.9576388888888889 | 0 |
| 0.9583333333333334 | 0 |
| 0.9590277777777777 | 0 |
| 0.9597222222222223 | 0 |
| 0.9604166666666667 | 0 |
| 0.9611111111111111 | 0 |
| 0.9618055555555555 | 0 |
| 0.9625 | 0 |
| 0.9631944444444445 | 0 |
| 0.9638888888888889 | 0 |
| 0.9645833333333332 | 0 |
| 0.9652777777777778 | 0 |
| 0.9659722222222222 | 0 |
| 0.9666666666666667 | 0 |
| 0.967361111111111 | 0 |
| 0.9680555555555556 | 0 |
| 0.96875 | 0 |
| 0.9694444444444444 | 0 |
| 0.970138888888889 | 0 |
| 0.9708333333333333 | 0 |
| 0.9715277777777778 | 0 |
| 0.9722222222222222 | 0 |
| 0.9729166666666668 | 0 |
| 0.9736111111111111 | 0 |
| 0.9743055555555555 | 0 |
| 0.975 | 0 |
| 0.9756944444444445 | 0 |
| 0.9763888888888889 | 0 |
| 0.9770833333333333 | 0 |
| 0.9777777777777777 | 0 |
| 0.9784722222222223 | 0 |
| 0.9791666666666666 | 0 |
| 0.9798611111111111 | 0 |
| 0.9805555555555556 | 0 |
| 0.9812500000000001 | 0 |
| 0.9819444444444444 | 0 |
| 0.9826388888888888 | 0 |
| 0.9833333333333334 | 0 |
| 0.9840277777777778 | 0 |
| 0.9847222222222222 | 0 |
| 0.9854166666666666 | 0 |
| 0.9861111111111112 | 0 |
| 0.9868055555555556 | 0 |
| 0.9874999999999999 | 0 |
| 0.9881944444444444 | 0 |
| 0.9888888888888889 | 0 |
| 0.9895833333333334 | 0 |
| 0.9902777777777777 | 0 |
| 0.9909722222222223 | 0 |
| 0.9916666666666667 | 0 |
| 0.9923611111111111 | 0 |
| 0.9930555555555555 | 0 |
| 0.99375 | 0 |
| 0.9944444444444445 | 0 |
| 0.9951388888888889 | 0 |
| 0.9958333333333332 | 0 |
| 0.9965277777777778 | 0 |
| 0.9972222222222222 | 0 |
| 0.9979166666666667 | 0 |
| 0.998611111111111 | 0 |
| 0.9993055555555556 | 0 |